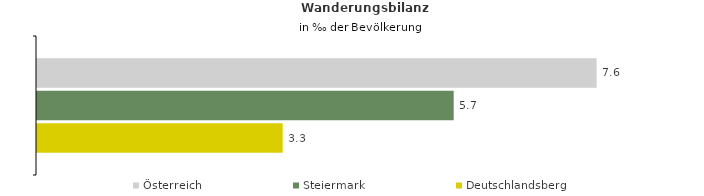
| Category | Österreich | Steiermark | Deutschlandsberg |
|---|---|---|---|
| Wanderungsrate in ‰ der Bevölkerung, Periode 2014-2018 | 7.62 | 5.673 | 3.345 |